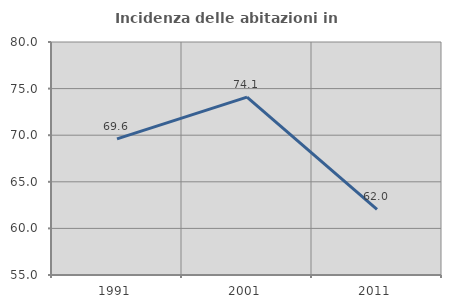
| Category | Incidenza delle abitazioni in proprietà  |
|---|---|
| 1991.0 | 69.599 |
| 2001.0 | 74.08 |
| 2011.0 | 62.041 |